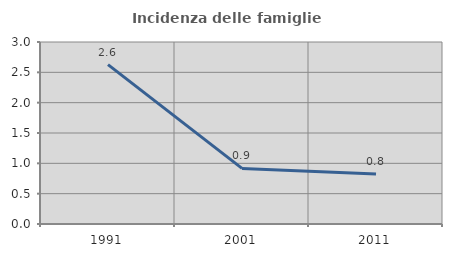
| Category | Incidenza delle famiglie numerose |
|---|---|
| 1991.0 | 2.627 |
| 2001.0 | 0.916 |
| 2011.0 | 0.823 |